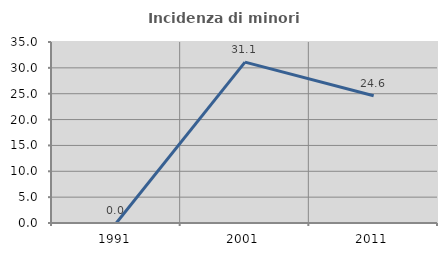
| Category | Incidenza di minori stranieri |
|---|---|
| 1991.0 | 0 |
| 2001.0 | 31.111 |
| 2011.0 | 24.615 |